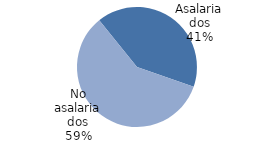
| Category | 659 |
|---|---|
| Asalariados | 658.992 |
| No asalariados | 941.409 |